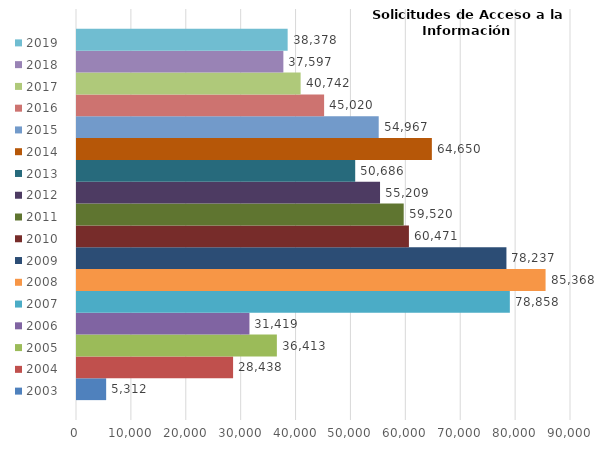
| Category | 2003 | 2004 | 2005 | 2006 | 2007 | 2008 | 2009 | 2010 | 2011 | 2012 | 2013 | 2014 | 2015 | 2016 | 2017 | 2018 | 2019 |
|---|---|---|---|---|---|---|---|---|---|---|---|---|---|---|---|---|---|
| 0 | 5312 | 28438 | 36413 | 31419 | 78858 | 85368 | 78237 | 60471 | 59520 | 55209 | 50686 | 64650 | 54967 | 45020 | 40742 | 37597 | 38378 |